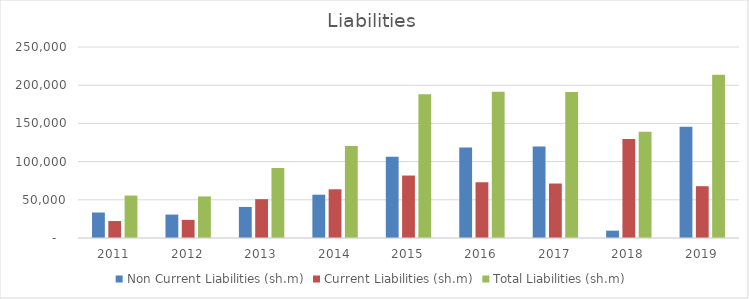
| Category | Non Current Liabilities (sh.m) | Current Liabilities (sh.m) | Total Liabilities (sh.m) |
|---|---|---|---|
| 2011 | 33360 | 22209 | 55569 |
| 2012 | 30653 | 23756 | 54409 |
| 2013 | 40646 | 50841 | 91487 |
| 2014 | 56672 | 63756 | 120428 |
| 2015 | 106273 | 81753 | 188026 |
| 2016 | 118410 | 72942 | 191352 |
| 2017 | 119758 | 71301 | 191059 |
| 2018 | 9611 | 129512 | 139123 |
| 2019 | 145754 | 67815 | 213569 |